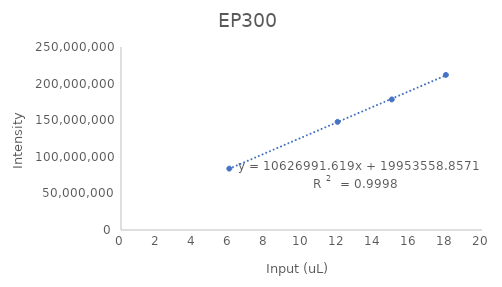
| Category | Series 0 |
|---|---|
| 12.0 | 147737056 |
| 6.0 | 83836132 |
| 15.0 | 178356744 |
| 18.0 | 211860876 |